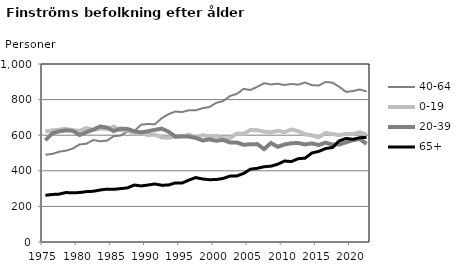
| Category | 40-64 | 0-19 | 20-39 | 65+ |
|---|---|---|---|---|
| 1975.0 | 490 | 621 | 572 | 262 |
| 1976.0 | 495 | 627 | 610 | 267 |
| 1977.0 | 507 | 631 | 622 | 269 |
| 1978.0 | 513 | 636 | 627 | 278 |
| 1979.0 | 525 | 627 | 625 | 276 |
| 1980.0 | 548 | 625 | 601 | 278 |
| 1981.0 | 552 | 640 | 617 | 283 |
| 1982.0 | 573 | 630 | 631 | 285 |
| 1983.0 | 566 | 637 | 649 | 292 |
| 1984.0 | 569 | 636 | 643 | 297 |
| 1985.0 | 595 | 648 | 623 | 296 |
| 1986.0 | 598 | 628 | 637 | 300 |
| 1987.0 | 621 | 628 | 635 | 304 |
| 1988.0 | 623 | 609 | 622 | 320 |
| 1989.0 | 659 | 611 | 616 | 315 |
| 1990.0 | 663 | 601 | 622 | 320 |
| 1991.0 | 661 | 603 | 630 | 326 |
| 1992.0 | 695 | 588 | 637 | 319 |
| 1993.0 | 718 | 585 | 620 | 320 |
| 1994.0 | 733 | 592 | 593 | 332 |
| 1995.0 | 730 | 591 | 594 | 331 |
| 1996.0 | 740 | 603 | 592 | 348 |
| 1997.0 | 740 | 586 | 585 | 362 |
| 1998.0 | 752 | 600 | 570 | 354 |
| 1999.0 | 758 | 593 | 576 | 350 |
| 2000.0 | 782 | 597 | 569 | 351 |
| 2001.0 | 791 | 583 | 573 | 357 |
| 2002.0 | 820 | 583 | 559 | 370 |
| 2003.0 | 832 | 609 | 559 | 371 |
| 2004.0 | 860 | 608 | 546 | 385 |
| 2005.0 | 854 | 629 | 549 | 409 |
| 2006.0 | 872 | 628 | 550 | 414 |
| 2007.0 | 892 | 620 | 522 | 423 |
| 2008.0 | 885 | 616 | 556 | 426 |
| 2009.0 | 889 | 625 | 535 | 437 |
| 2010.0 | 882 | 617 | 548 | 455 |
| 2011.0 | 888 | 632 | 555 | 452 |
| 2012.0 | 884 | 623 | 556 | 468 |
| 2013.0 | 896 | 605 | 548 | 471 |
| 2014.0 | 881 | 599 | 554 | 500 |
| 2015.0 | 879 | 589 | 545 | 509 |
| 2016.0 | 899 | 612 | 558 | 525 |
| 2017.0 | 895 | 607 | 547 | 531 |
| 2018.0 | 872 | 600 | 548 | 568 |
| 2019.0 | 843 | 608 | 560 | 582 |
| 2020.0 | 848 | 606 | 572 | 577 |
| 2021.0 | 857 | 616 | 579 | 586 |
| 2022.0 | 846 | 603 | 551 | 588 |